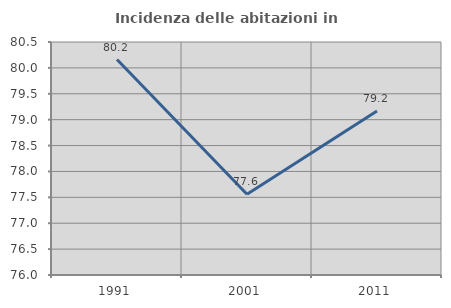
| Category | Incidenza delle abitazioni in proprietà  |
|---|---|
| 1991.0 | 80.162 |
| 2001.0 | 77.559 |
| 2011.0 | 79.167 |